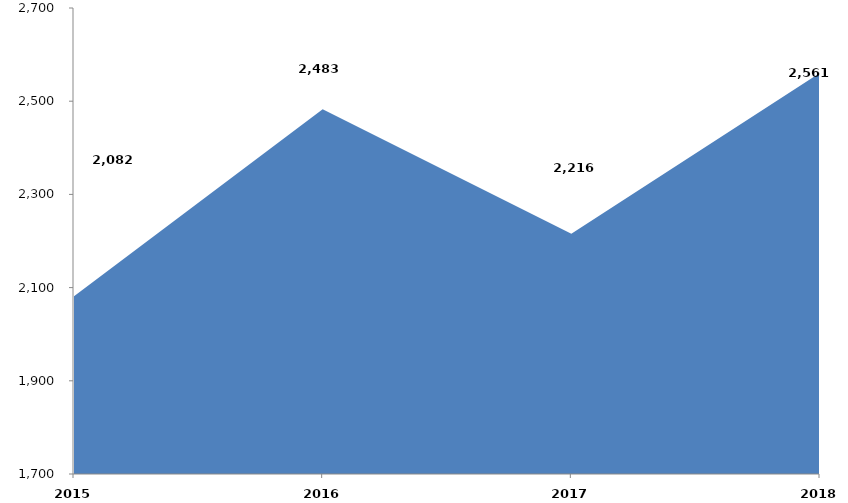
| Category | Series 0 |
|---|---|
| 2015 | 2081594 |
| 2016 | 2482839.641 |
| 2017 | 2215623.385 |
| 2018 | 2561094.322 |